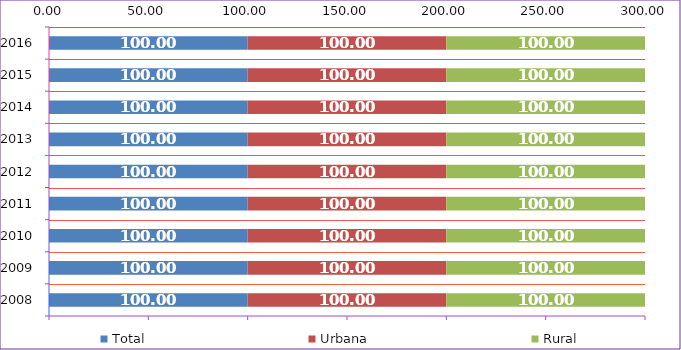
| Category | Total | Urbana | Rural |
|---|---|---|---|
| 2008.0 | 100 | 100 | 100 |
| 2009.0 | 100 | 100 | 100 |
| 2010.0 | 100 | 100 | 100 |
| 2011.0 | 100 | 100 | 100 |
| 2012.0 | 100 | 100 | 100 |
| 2013.0 | 100 | 100 | 100 |
| 2014.0 | 100 | 100 | 100 |
| 2015.0 | 100 | 100 | 100 |
| 2016.0 | 100 | 100 | 100 |